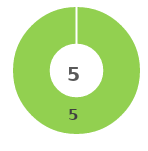
| Category | Series 0 |
|---|---|
| 0 | 0 |
| 1 | 5 |
| 2 | 0 |
| 3 | 0 |
| 4 | 0 |